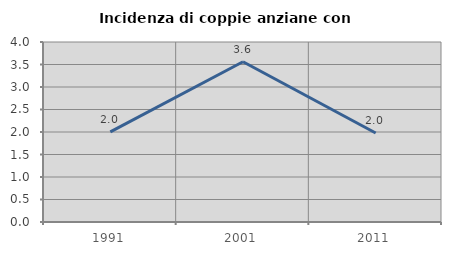
| Category | Incidenza di coppie anziane con figli |
|---|---|
| 1991.0 | 2.003 |
| 2001.0 | 3.562 |
| 2011.0 | 1.977 |